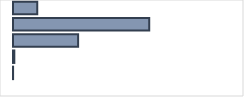
| Category | Series 0 |
|---|---|
| 0 | 10.686 |
| 1 | 60.01 |
| 2 | 28.685 |
| 3 | 0.581 |
| 4 | 0.036 |